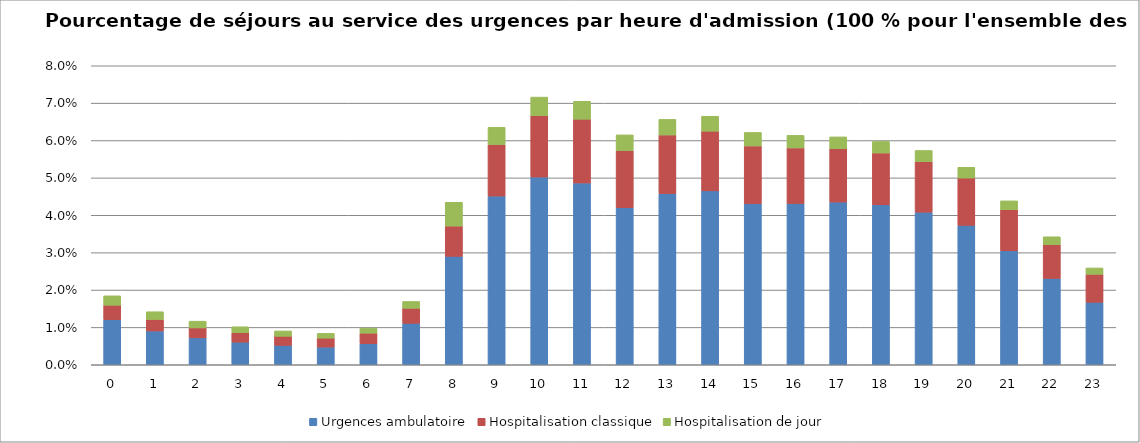
| Category | Urgences ambulatoire | Hospitalisation classique | Hospitalisation de jour |
|---|---|---|---|
| 0.0 | 0.012 | 0.004 | 0.003 |
| 1.0 | 0.009 | 0.003 | 0.002 |
| 2.0 | 0.007 | 0.003 | 0.002 |
| 3.0 | 0.006 | 0.003 | 0.002 |
| 4.0 | 0.005 | 0.002 | 0.001 |
| 5.0 | 0.005 | 0.002 | 0.001 |
| 6.0 | 0.006 | 0.003 | 0.001 |
| 7.0 | 0.011 | 0.004 | 0.002 |
| 8.0 | 0.029 | 0.008 | 0.006 |
| 9.0 | 0.045 | 0.014 | 0.005 |
| 10.0 | 0.05 | 0.016 | 0.005 |
| 11.0 | 0.049 | 0.017 | 0.005 |
| 12.0 | 0.042 | 0.015 | 0.004 |
| 13.0 | 0.046 | 0.016 | 0.004 |
| 14.0 | 0.047 | 0.016 | 0.004 |
| 15.0 | 0.043 | 0.015 | 0.004 |
| 16.0 | 0.043 | 0.015 | 0.003 |
| 17.0 | 0.044 | 0.014 | 0.003 |
| 18.0 | 0.043 | 0.014 | 0.003 |
| 19.0 | 0.041 | 0.013 | 0.003 |
| 20.0 | 0.037 | 0.013 | 0.003 |
| 21.0 | 0.03 | 0.011 | 0.002 |
| 22.0 | 0.023 | 0.009 | 0.002 |
| 23.0 | 0.017 | 0.007 | 0.002 |